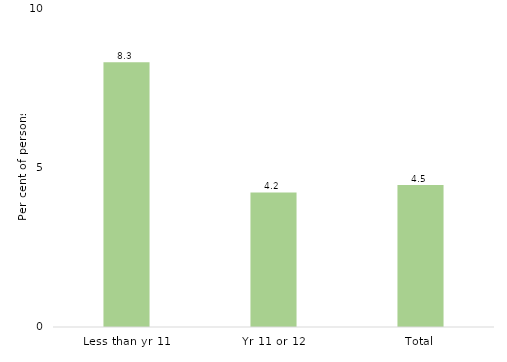
| Category | Series 0 |
|---|---|
| Less than yr 11 | 8.3 |
| Yr 11 or 12 | 4.216 |
| Total | 4.454 |